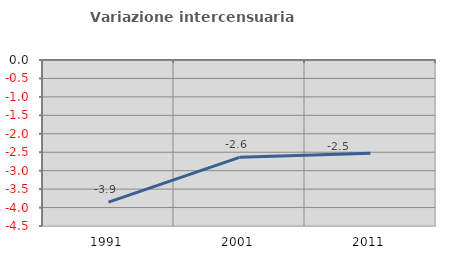
| Category | Variazione intercensuaria annua |
|---|---|
| 1991.0 | -3.854 |
| 2001.0 | -2.638 |
| 2011.0 | -2.527 |